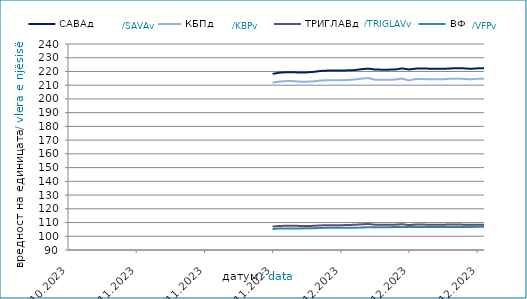
| Category | САВАд | КБПд | ТРИГЛАВд | ВФПд |
|---|---|---|---|---|
| 2023-11-30 | 218.222 | 211.832 | 107.079 | 105.249 |
| 2023-12-01 | 219.134 | 212.648 | 107.498 | 105.613 |
| 2023-12-02 | 219.419 | 212.967 | 107.663 | 105.672 |
| 2023-12-03 | 219.427 | 212.976 | 107.669 | 105.678 |
| 2023-12-04 | 219.242 | 212.599 | 107.518 | 105.649 |
| 2023-12-05 | 219.335 | 212.567 | 107.489 | 105.802 |
| 2023-12-06 | 219.681 | 212.759 | 107.584 | 105.9 |
| 2023-12-07 | 220.369 | 213.392 | 107.901 | 105.981 |
| 2023-12-08 | 220.611 | 213.64 | 108.047 | 106.151 |
| 2023-12-09 | 220.619 | 213.649 | 108.052 | 106.157 |
| 2023-12-10 | 220.628 | 213.657 | 108.058 | 106.163 |
| 2023-12-11 | 220.81 | 213.84 | 108.204 | 106.176 |
| 2023-12-12 | 221.008 | 214.142 | 108.356 | 106.25 |
| 2023-12-13 | 221.635 | 214.719 | 108.675 | 106.318 |
| 2023-12-14 | 222.097 | 215.247 | 108.94 | 106.597 |
| 2023-12-15 | 221.434 | 214.045 | 108.423 | 106.643 |
| 2023-12-16 | 221.309 | 213.901 | 108.352 | 106.623 |
| 2023-12-17 | 221.319 | 213.91 | 108.357 | 106.63 |
| 2023-12-18 | 221.469 | 214.17 | 108.47 | 106.683 |
| 2023-12-19 | 222.208 | 214.779 | 108.785 | 106.783 |
| 2023-12-20 | 221.474 | 213.488 | 108.124 | 106.816 |
| 2023-12-21 | 222.073 | 214.532 | 108.566 | 106.703 |
| 2023-12-22 | 222.206 | 214.514 | 108.513 | 106.772 |
| 2023-12-23 | 222.031 | 214.309 | 108.415 | 106.744 |
| 2023-12-24 | 222.041 | 214.318 | 108.421 | 106.751 |
| 2023-12-25 | 221.914 | 214.317 | 108.423 | 106.708 |
| 2023-12-26 | 222.185 | 214.68 | 108.566 | 106.724 |
| 2023-12-27 | 222.35 | 214.796 | 108.603 | 106.742 |
| 2023-12-28 | 222.274 | 214.584 | 108.442 | 106.796 |
| 2023-12-29 | 221.923 | 214.246 | 108.282 | 106.82 |
| 2023-12-30 | 222.254 | 214.61 | 108.436 | 106.883 |
| 2023-12-31 | 222.264 | 214.619 | 108.443 | 106.889 |